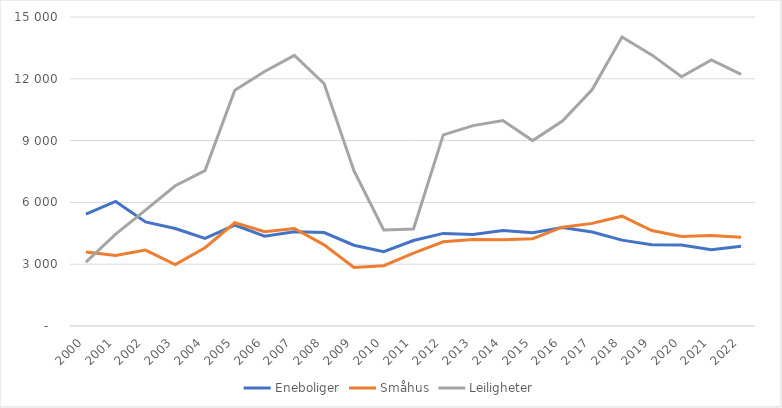
| Category | Eneboliger | Småhus | Leiligheter |
|---|---|---|---|
| 2000.0 | 5433 | 3589 | 3101 |
| 2001.0 | 6046 | 3423 | 4463 |
| 2002.0 | 5051 | 3687 | 5629 |
| 2003.0 | 4733 | 2977 | 6807 |
| 2004.0 | 4248 | 3802 | 7542 |
| 2005.0 | 4899 | 5013 | 11449 |
| 2006.0 | 4356 | 4577 | 12353 |
| 2007.0 | 4580 | 4731 | 13133 |
| 2008.0 | 4536 | 3941 | 11761 |
| 2009.0 | 3922 | 2841 | 7537 |
| 2010.0 | 3612 | 2927 | 4666 |
| 2011.0 | 4151 | 3535 | 4707 |
| 2012.0 | 4495 | 4091 | 9279 |
| 2013.0 | 4447 | 4195 | 9727 |
| 2014.0 | 4635 | 4189 | 9971 |
| 2015.0 | 4525 | 4238 | 9001 |
| 2016.0 | 4785 | 4799 | 9952 |
| 2017.0 | 4566 | 4981 | 11480 |
| 2018.0 | 4169 | 5331 | 14026 |
| 2019.0 | 3940 | 4637 | 13160 |
| 2020.0 | 3936 | 4347 | 12097 |
| 2021.0 | 3705 | 4398 | 12913 |
| 2022.0 | 3866 | 4308 | 12213 |